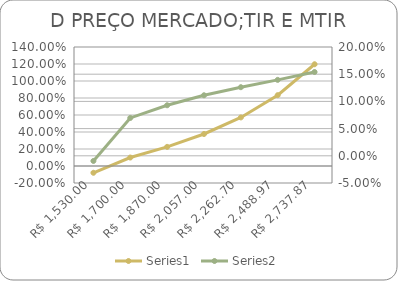
| Category | Series 0 |
|---|---|
| 1530.0 | -0.08 |
| 1700.0 | 0.1 |
| 1870.0000000000002 | 0.225 |
| 2057.0000000000005 | 0.377 |
| 2262.7000000000007 | 0.571 |
| 2488.970000000001 | 0.833 |
| 2737.8670000000016 | 1.197 |